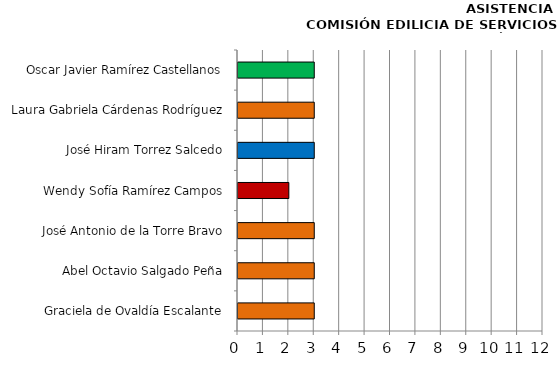
| Category | Series 0 |
|---|---|
| Graciela de Ovaldía Escalante | 3 |
| Abel Octavio Salgado Peña | 3 |
| José Antonio de la Torre Bravo | 3 |
| Wendy Sofía Ramírez Campos | 2 |
| José Hiram Torrez Salcedo | 3 |
| Laura Gabriela Cárdenas Rodríguez | 3 |
| Oscar Javier Ramírez Castellanos | 3 |